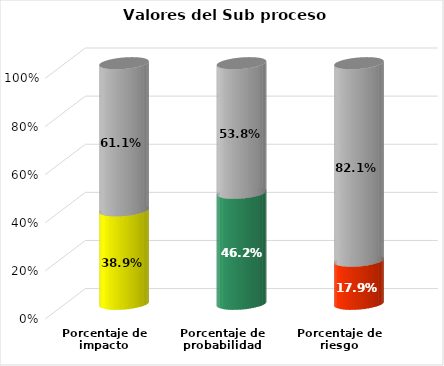
| Category | Series 0 | Series 1 |
|---|---|---|
| Porcentaje de impacto | 0.389 | 0.611 |
| Porcentaje de probabilidad | 0.462 | 0.538 |
| Porcentaje de riesgo | 0.179 | 0.821 |